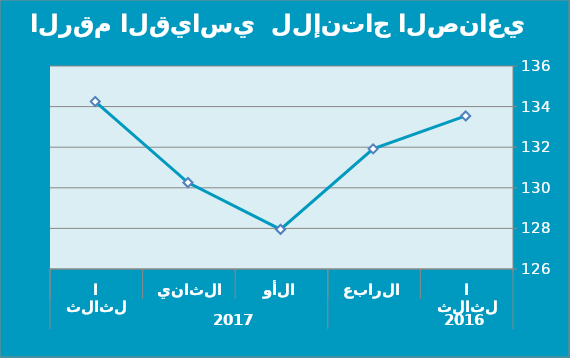
| Category | Series 0 |
|---|---|
| 0 | 133.54 |
| 1 | 131.92 |
| 2 | 127.95 |
| 3 | 130.26 |
| 4 | 134.25 |